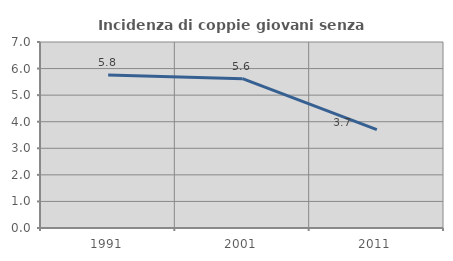
| Category | Incidenza di coppie giovani senza figli |
|---|---|
| 1991.0 | 5.762 |
| 2001.0 | 5.618 |
| 2011.0 | 3.701 |